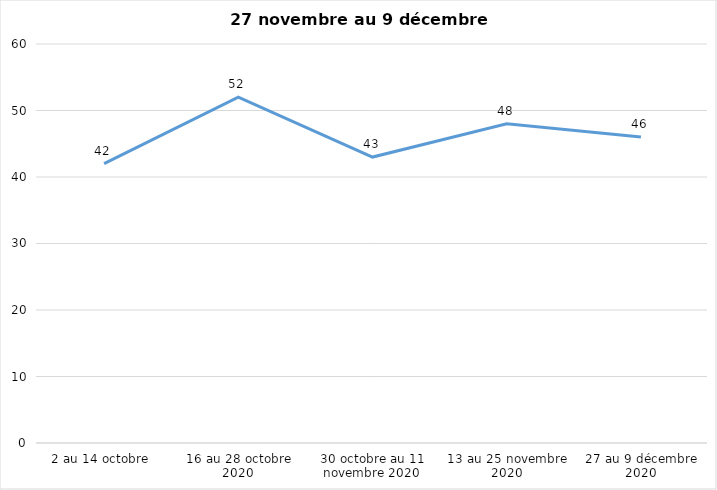
| Category | Series 0 |
|---|---|
| 2 au 14 octobre  | 42 |
| 16 au 28 octobre 2020 | 52 |
| 30 octobre au 11 novembre 2020 | 43 |
| 13 au 25 novembre 2020 | 48 |
| 27 au 9 décembre 2020 | 46 |